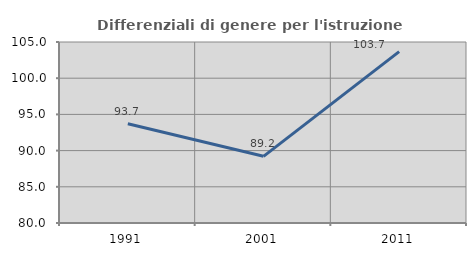
| Category | Differenziali di genere per l'istruzione superiore |
|---|---|
| 1991.0 | 93.72 |
| 2001.0 | 89.209 |
| 2011.0 | 103.678 |